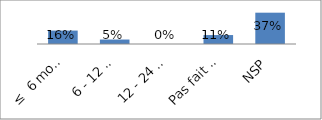
| Category | Series 0 |
|---|---|
| ≤  6 mois après la fin de l'année budgétaire | 0.158 |
| 6 - 12 mois | 0.053 |
| 12 - 24 mois | 0 |
| Pas fait 24 mois après la fin de l'année budgétaire | 0.105 |
| NSP | 0.368 |